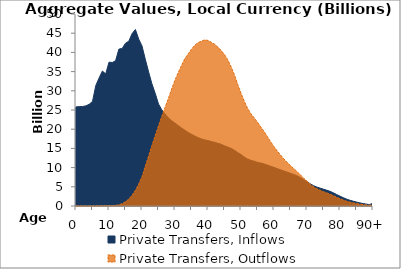
| Category | Private Transfers, Inflows | Private Transfers, Outflows |
|---|---|---|
| 0 | 25797.838 | 0 |
|  | 25890.237 | 0 |
| 2 | 25918.782 | 0 |
| 3 | 26081.943 | 0 |
| 4 | 26491.017 | 0 |
| 5 | 27229.678 | 1.903 |
| 6 | 31387.922 | 26.549 |
| 7 | 33342.855 | 59.022 |
| 8 | 35149.077 | 84.725 |
| 9 | 34399.25 | 100.504 |
| 10 | 37453.745 | 111.705 |
| 11 | 37374.69 | 116.998 |
| 12 | 37846.629 | 165.991 |
| 13 | 40852.93 | 303.483 |
| 14 | 41036 | 609.84 |
| 15 | 42382.219 | 1113.406 |
| 16 | 42912.803 | 1804.795 |
| 17 | 44889.175 | 2788.536 |
| 18 | 45968.801 | 4079.239 |
| 19 | 43469.32 | 5705.567 |
| 20 | 41670.006 | 7630.998 |
| 21 | 38206.013 | 10338.016 |
| 22 | 34928.188 | 12995.787 |
| 23 | 31840.341 | 15728.236 |
| 24 | 29347.401 | 18307.536 |
| 25 | 26559.975 | 20840.053 |
| 26 | 25047.464 | 23354.339 |
| 27 | 23940.188 | 25715.235 |
| 28 | 22943.544 | 28018.867 |
| 29 | 22219.541 | 30508.956 |
| 30 | 21574.434 | 32785.813 |
| 31 | 20946.881 | 34791.522 |
| 32 | 20315.812 | 36654.703 |
| 33 | 19714.599 | 38404.368 |
| 34 | 19150.681 | 39630.425 |
| 35 | 18672.696 | 40834.142 |
| 36 | 18222.158 | 41866.977 |
| 37 | 17810.398 | 42560.841 |
| 38 | 17468.73 | 42925.809 |
| 39 | 17208.39 | 43255.149 |
| 40 | 17026.441 | 43114.452 |
| 41 | 16796.109 | 42634.345 |
| 42 | 16572.215 | 42152.546 |
| 43 | 16320.912 | 41387.549 |
| 44 | 16072.854 | 40507.124 |
| 45 | 15662.25 | 39423.949 |
| 46 | 15354.941 | 38078.239 |
| 47 | 15006.203 | 36269.157 |
| 48 | 14514.098 | 34173.681 |
| 49 | 13918.749 | 31699.209 |
| 50 | 13402.701 | 29387.642 |
| 51 | 12764.469 | 27288.886 |
| 52 | 12223.417 | 25429.269 |
| 53 | 11891.965 | 24030.304 |
| 54 | 11650.765 | 22962.645 |
| 55 | 11370.75 | 21808.72 |
| 56 | 11182.679 | 20595.095 |
| 57 | 10951.412 | 19388.834 |
| 58 | 10656.495 | 18082.567 |
| 59 | 10344.85 | 16707.355 |
| 60 | 10050.468 | 15469.108 |
| 61 | 9725.552 | 14319.727 |
| 62 | 9413.831 | 13258.614 |
| 63 | 9115.931 | 12267.852 |
| 64 | 8812.237 | 11372.09 |
| 65 | 8511.735 | 10525.244 |
| 66 | 8213.771 | 9749.039 |
| 67 | 7855.538 | 8947.244 |
| 68 | 7398.621 | 8113.023 |
| 69 | 6880.564 | 7262.147 |
| 70 | 6340.657 | 6454.597 |
| 71 | 5780.745 | 5662.082 |
| 72 | 5289.438 | 4990.303 |
| 73 | 4922.703 | 4482.267 |
| 74 | 4650.928 | 4090.973 |
| 75 | 4376.189 | 3723.133 |
| 76 | 4112.725 | 3402.007 |
| 77 | 3816.348 | 3070.799 |
| 78 | 3429.518 | 2680.35 |
| 79 | 2979.531 | 2267.009 |
| 80 | 2562.602 | 1892.339 |
| 81 | 2161.224 | 1545.858 |
| 82 | 1796.267 | 1242.186 |
| 83 | 1496.185 | 1002.094 |
| 84 | 1254.216 | 810.41 |
| 85 | 1026.712 | 640.277 |
| 86 | 815.207 | 489.24 |
| 87 | 634.064 | 364.743 |
| 88 | 485.655 | 265.266 |
| 89 | 364.551 | 188.559 |
| 90+ | 752.646 | 367.536 |